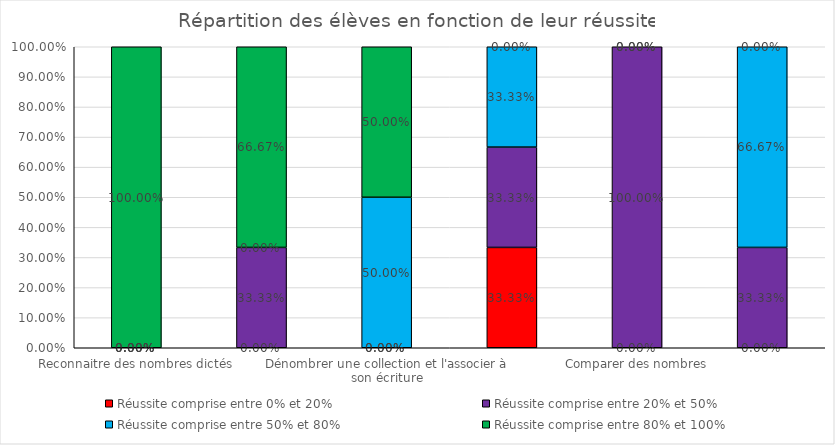
| Category | Réussite comprise entre 0% et 20% | Réussite comprise entre 20% et 50% | Réussite comprise entre 50% et 80% | Réussite comprise entre 80% et 100% |
|---|---|---|---|---|
| Reconnaitre des nombres dictés | 0 | 0 | 0 | 1 |
| Ecrire des nombres sous la dictée | 0 | 0.333 | 0 | 0.667 |
| Dénombrer une collection et l'associer à son écriture | 0 | 0 | 0.5 | 0.5 |
| Placer un nombre sur une ligne numérique | 0.333 | 0.333 | 0.333 | 0 |
| Comparer des nombres | 0 | 1 | 0 | 0 |
| Résoudre des problèmes | 0 | 0.333 | 0.667 | 0 |